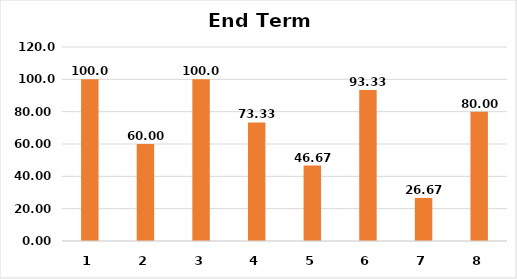
| Category | Series 0 |
|---|---|
| 0 | 100 |
| 1 | 60 |
| 2 | 100 |
| 3 | 73.333 |
| 4 | 46.667 |
| 5 | 93.333 |
| 6 | 26.667 |
| 7 | 80 |